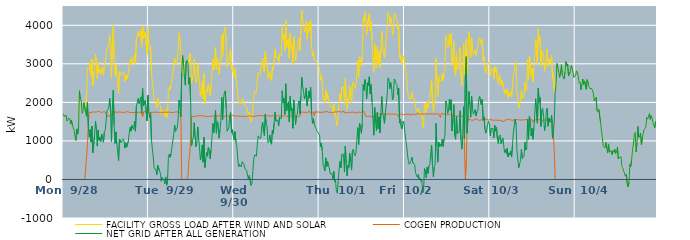
| Category | FACILITY GROSS LOAD AFTER WIND AND SOLAR | COGEN PRODUCTION | NET GRID AFTER ALL GENERATION |
|---|---|---|---|
|  Mon  9/28 | 1703 | 0 | 1703 |
|  Mon  9/28 | 1626 | 0 | 1626 |
|  Mon  9/28 | 1619 | 0 | 1619 |
|  Mon  9/28 | 1670 | 0 | 1670 |
|  Mon  9/28 | 1515 | 0 | 1515 |
|  Mon  9/28 | 1556 | 0 | 1556 |
|  Mon  9/28 | 1595 | 0 | 1595 |
|  Mon  9/28 | 1568 | 0 | 1568 |
|  Mon  9/28 | 1447 | 0 | 1447 |
|  Mon  9/28 | 1543 | 0 | 1543 |
|  Mon  9/28 | 1411 | 0 | 1411 |
|  Mon  9/28 | 1434 | 0 | 1434 |
|  Mon  9/28 | 1281 | 0 | 1281 |
|  Mon  9/28 | 1116 | 0 | 1116 |
|  Mon  9/28 | 1014 | 0 | 1014 |
|  Mon  9/28 | 1313 | 0 | 1313 |
|  Mon  9/28 | 1176 | 0 | 1176 |
|  Mon  9/28 | 1331 | 0 | 1331 |
|  Mon  9/28 | 2301 | 0 | 2301 |
|  Mon  9/28 | 2083 | 0 | 2083 |
|  Mon  9/28 | 2044 | 0 | 2044 |
|  Mon  9/28 | 1716 | 0 | 1716 |
|  Mon  9/28 | 1762 | 0 | 1762 |
|  Mon  9/28 | 1992 | 0 | 1992 |
|  Mon  9/28 | 1969 | 0 | 1969 |
|  Mon  9/28 | 1754 | 0 | 1754 |
|  Mon  9/28 | 2231 | 593 | 1638 |
|  Mon  9/28 | 2897 | 901 | 1996 |
|  Mon  9/28 | 2872 | 1488 | 1384 |
|  Mon  9/28 | 2842 | 1745 | 1097 |
|  Mon  9/28 | 3033 | 1740 | 1293 |
|  Mon  9/28 | 2704 | 1734 | 970 |
|  Mon  9/28 | 3122 | 1739 | 1383 |
|  Mon  9/28 | 2438 | 1752 | 686 |
|  Mon  9/28 | 2437 | 1738 | 699 |
|  Mon  9/28 | 2882 | 1747 | 1135 |
|  Mon  9/28 | 3245 | 1741 | 1504 |
|  Mon  9/28 | 3057 | 1749 | 1308 |
|  Mon  9/28 | 2603 | 1738 | 865 |
|  Mon  9/28 | 3045 | 1765 | 1280 |
|  Mon  9/28 | 2768 | 1755 | 1013 |
|  Mon  9/28 | 2844 | 1750 | 1094 |
|  Mon  9/28 | 2729 | 1746 | 983 |
|  Mon  9/28 | 2912 | 1739 | 1173 |
|  Mon  9/28 | 2822 | 1757 | 1065 |
|  Mon  9/28 | 2722 | 1757 | 965 |
|  Mon  9/28 | 2969 | 1734 | 1235 |
|  Mon  9/28 | 3024 | 1750 | 1274 |
|  Mon  9/28 | 3035 | 1738 | 1297 |
|  Mon  9/28 | 3433 | 1648 | 1785 |
|  Mon  9/28 | 3402 | 1635 | 1767 |
|  Mon  9/28 | 3506 | 1651 | 1855 |
|  Mon  9/28 | 3754 | 1643 | 2111 |
|  Mon  9/28 | 3448 | 1638 | 1810 |
|  Mon  9/28 | 2638 | 1655 | 983 |
|  Mon  9/28 | 3520 | 1697 | 1823 |
|  Mon  9/28 | 4006 | 1689 | 2317 |
|  Mon  9/28 | 3122 | 1704 | 1418 |
|  Mon  9/28 | 2707 | 1774 | 933 |
|  Mon  9/28 | 2972 | 1738 | 1234 |
|  Mon  9/28 | 2686 | 1751 | 935 |
|  Mon  9/28 | 2477 | 1745 | 732 |
|  Mon  9/28 | 2230 | 1739 | 491 |
|  Mon  9/28 | 2799 | 1750 | 1049 |
|  Mon  9/28 | 2808 | 1758 | 1050 |
|  Mon  9/28 | 2702 | 1745 | 957 |
|  Mon  9/28 | 2719 | 1741 | 978 |
|  Mon  9/28 | 2794 | 1740 | 1054 |
|  Mon  9/28 | 2754 | 1730 | 1024 |
|  Mon  9/28 | 2546 | 1732 | 814 |
|  Mon  9/28 | 2713 | 1761 | 952 |
|  Mon  9/28 | 2585 | 1748 | 837 |
|  Mon  9/28 | 2584 | 1756 | 828 |
|  Mon  9/28 | 2750 | 1756 | 994 |
|  Mon  9/28 | 2946 | 1743 | 1203 |
|  Mon  9/28 | 3089 | 1734 | 1355 |
|  Mon  9/28 | 2987 | 1734 | 1253 |
|  Mon  9/28 | 3159 | 1756 | 1403 |
|  Mon  9/28 | 3068 | 1736 | 1332 |
|  Mon  9/28 | 3037 | 1738 | 1299 |
|  Mon  9/28 | 3249 | 1738 | 1511 |
|  Mon  9/28 | 2991 | 1740 | 1251 |
|  Mon  9/28 | 3643 | 1742 | 1901 |
|  Mon  9/28 | 3654 | 1741 | 1913 |
|  Mon  9/28 | 3842 | 1741 | 2101 |
|  Mon  9/28 | 3708 | 1736 | 1972 |
|  Mon  9/28 | 3789 | 1745 | 2044 |
|  Mon  9/28 | 3880 | 1740 | 2140 |
|  Mon  9/28 | 3451 | 1740 | 1711 |
|  Mon  9/28 | 3986 | 1628 | 2358 |
|  Mon  9/28 | 3657 | 1752 | 1905 |
|  Mon  9/28 | 3663 | 1750 | 1913 |
|  Mon  9/28 | 3811 | 1764 | 2047 |
|  Mon  9/28 | 3834 | 1762 | 2072 |
|  Mon  9/28 | 3249 | 1731 | 1518 |
|  Mon  9/28 | 3939 | 1754 | 2185 |
|  Tue  9/29 | 3502 | 1741 | 1761 |
|  Tue  9/29 | 3363 | 1758 | 1605 |
|  Tue  9/29 | 3459 | 1734 | 1725 |
|  Tue  9/29 | 2756 | 1724 | 1032 |
|  Tue  9/29 | 2527 | 1742 | 785 |
|  Tue  9/29 | 2349 | 1758 | 591 |
|  Tue  9/29 | 2045 | 1743 | 302 |
|  Tue  9/29 | 2040 | 1759 | 281 |
|  Tue  9/29 | 1990 | 1749 | 241 |
|  Tue  9/29 | 1871 | 1753 | 118 |
|  Tue  9/29 | 2109 | 1741 | 368 |
|  Tue  9/29 | 2097 | 1754 | 343 |
|  Tue  9/29 | 1961 | 1735 | 226 |
|  Tue  9/29 | 1903 | 1738 | 165 |
|  Tue  9/29 | 1694 | 1743 | -49 |
|  Tue  9/29 | 1797 | 1745 | 52 |
|  Tue  9/29 | 1766 | 1739 | 27 |
|  Tue  9/29 | 1738 | 1739 | -1 |
|  Tue  9/29 | 1639 | 1747 | -108 |
|  Tue  9/29 | 1812 | 1746 | 66 |
|  Tue  9/29 | 1593 | 1743 | -150 |
|  Tue  9/29 | 1678 | 1748 | -70 |
|  Tue  9/29 | 2294 | 1747 | 547 |
|  Tue  9/29 | 2397 | 1737 | 660 |
|  Tue  9/29 | 2322 | 1745 | 577 |
|  Tue  9/29 | 2423 | 1750 | 673 |
|  Tue  9/29 | 2588 | 1737 | 851 |
|  Tue  9/29 | 2579 | 1747 | 832 |
|  Tue  9/29 | 2898 | 1735 | 1163 |
|  Tue  9/29 | 3152 | 1738 | 1414 |
|  Tue  9/29 | 3002 | 1752 | 1250 |
|  Tue  9/29 | 2973 | 1744 | 1229 |
|  Tue  9/29 | 3089 | 1752 | 1337 |
|  Tue  9/29 | 3325 | 1746 | 1579 |
|  Tue  9/29 | 3803 | 1742 | 2061 |
|  Tue  9/29 | 3639 | 1749 | 1890 |
|  Tue  9/29 | 3363 | 1731 | 1632 |
|  Tue  9/29 | 2765 | 0 | 2765 |
|  Tue  9/29 | 3217 | 0 | 3217 |
|  Tue  9/29 | 3011 | 0 | 3011 |
|  Tue  9/29 | 2675 | 0 | 2675 |
|  Tue  9/29 | 2447 | 0 | 2447 |
|  Tue  9/29 | 3049 | 0 | 3049 |
|  Tue  9/29 | 3095 | 0 | 3095 |
|  Tue  9/29 | 3071 | 67 | 3004 |
|  Tue  9/29 | 2972 | 501 | 2471 |
|  Tue  9/29 | 3275 | 638 | 2637 |
|  Tue  9/29 | 3156 | 1097 | 2059 |
|  Tue  9/29 | 2489 | 1624 | 865 |
|  Tue  9/29 | 2636 | 1643 | 993 |
|  Tue  9/29 | 2713 | 1633 | 1080 |
|  Tue  9/29 | 3126 | 1654 | 1472 |
|  Tue  9/29 | 3107 | 1630 | 1477 |
|  Tue  9/29 | 2511 | 1656 | 855 |
|  Tue  9/29 | 2546 | 1643 | 903 |
|  Tue  9/29 | 3005 | 1642 | 1363 |
|  Tue  9/29 | 2724 | 1645 | 1079 |
|  Tue  9/29 | 2502 | 1659 | 843 |
|  Tue  9/29 | 2158 | 1652 | 506 |
|  Tue  9/29 | 2277 | 1652 | 625 |
|  Tue  9/29 | 2546 | 1649 | 897 |
|  Tue  9/29 | 2103 | 1654 | 449 |
|  Tue  9/29 | 2756 | 1661 | 1095 |
|  Tue  9/29 | 1954 | 1645 | 309 |
|  Tue  9/29 | 2129 | 1612 | 517 |
|  Tue  9/29 | 2338 | 1639 | 699 |
|  Tue  9/29 | 2267 | 1664 | 603 |
|  Tue  9/29 | 2471 | 1632 | 839 |
|  Tue  9/29 | 2388 | 1640 | 748 |
|  Tue  9/29 | 2176 | 1640 | 536 |
|  Tue  9/29 | 2419 | 1649 | 770 |
|  Tue  9/29 | 2736 | 1650 | 1086 |
|  Tue  9/29 | 3117 | 1662 | 1455 |
|  Tue  9/29 | 2854 | 1644 | 1210 |
|  Tue  9/29 | 3155 | 1655 | 1500 |
|  Tue  9/29 | 3434 | 1640 | 1794 |
|  Tue  9/29 | 2842 | 1643 | 1199 |
|  Tue  9/29 | 3138 | 1641 | 1497 |
|  Tue  9/29 | 3085 | 1642 | 1443 |
|  Tue  9/29 | 2727 | 1657 | 1070 |
|  Tue  9/29 | 2929 | 1649 | 1280 |
|  Tue  9/29 | 3165 | 1640 | 1525 |
|  Tue  9/29 | 3769 | 1637 | 2132 |
|  Tue  9/29 | 3190 | 1640 | 1550 |
|  Tue  9/29 | 3742 | 1660 | 2082 |
|  Tue  9/29 | 3876 | 1626 | 2250 |
|  Tue  9/29 | 3954 | 1655 | 2299 |
|  Tue  9/29 | 3503 | 1646 | 1857 |
|  Tue  9/29 | 2913 | 1659 | 1254 |
|  Tue  9/29 | 2955 | 1650 | 1305 |
|  Tue  9/29 | 2967 | 1632 | 1335 |
|  Tue  9/29 | 3300 | 1644 | 1656 |
|  Tue  9/29 | 3372 | 1639 | 1733 |
|  Tue  9/29 | 2860 | 1641 | 1219 |
|  Tue  9/29 | 2955 | 1664 | 1291 |
|  Tue  9/29 | 2776 | 1641 | 1135 |
|  Wed  9/30 | 2667 | 1645 | 1022 |
|  Wed  9/30 | 2878 | 1639 | 1239 |
|  Wed  9/30 | 2616 | 1644 | 972 |
|  Wed  9/30 | 2501 | 1645 | 856 |
|  Wed  9/30 | 2202 | 1646 | 556 |
|  Wed  9/30 | 1973 | 1647 | 326 |
|  Wed  9/30 | 2033 | 1642 | 391 |
|  Wed  9/30 | 2026 | 1650 | 376 |
|  Wed  9/30 | 1961 | 1634 | 327 |
|  Wed  9/30 | 2105 | 1643 | 462 |
|  Wed  9/30 | 2084 | 1642 | 442 |
|  Wed  9/30 | 2041 | 1653 | 388 |
|  Wed  9/30 | 1905 | 1629 | 276 |
|  Wed  9/30 | 1901 | 1633 | 268 |
|  Wed  9/30 | 1880 | 1636 | 244 |
|  Wed  9/30 | 1858 | 1634 | 224 |
|  Wed  9/30 | 1654 | 1653 | 1 |
|  Wed  9/30 | 1748 | 1648 | 100 |
|  Wed  9/30 | 1744 | 1644 | 100 |
|  Wed  9/30 | 1495 | 1650 | -155 |
|  Wed  9/30 | 1543 | 1640 | -97 |
|  Wed  9/30 | 1536 | 1639 | -103 |
|  Wed  9/30 | 2156 | 1633 | 523 |
|  Wed  9/30 | 2287 | 1650 | 637 |
|  Wed  9/30 | 2293 | 1644 | 649 |
|  Wed  9/30 | 2247 | 1642 | 605 |
|  Wed  9/30 | 2555 | 1648 | 907 |
|  Wed  9/30 | 2779 | 1648 | 1131 |
|  Wed  9/30 | 2739 | 1656 | 1083 |
|  Wed  9/30 | 2712 | 1646 | 1066 |
|  Wed  9/30 | 2733 | 1662 | 1071 |
|  Wed  9/30 | 3019 | 1650 | 1369 |
|  Wed  9/30 | 3134 | 1646 | 1488 |
|  Wed  9/30 | 2893 | 1649 | 1244 |
|  Wed  9/30 | 2781 | 1652 | 1129 |
|  Wed  9/30 | 3333 | 1638 | 1695 |
|  Wed  9/30 | 3073 | 1647 | 1426 |
|  Wed  9/30 | 3024 | 1647 | 1377 |
|  Wed  9/30 | 2610 | 1655 | 955 |
|  Wed  9/30 | 2628 | 1643 | 985 |
|  Wed  9/30 | 2798 | 1645 | 1153 |
|  Wed  9/30 | 2618 | 1653 | 965 |
|  Wed  9/30 | 2565 | 1651 | 914 |
|  Wed  9/30 | 2918 | 1638 | 1280 |
|  Wed  9/30 | 2846 | 1653 | 1193 |
|  Wed  9/30 | 3124 | 1647 | 1477 |
|  Wed  9/30 | 3391 | 1644 | 1747 |
|  Wed  9/30 | 3155 | 1642 | 1513 |
|  Wed  9/30 | 3161 | 1648 | 1513 |
|  Wed  9/30 | 3170 | 1634 | 1536 |
|  Wed  9/30 | 3032 | 1647 | 1385 |
|  Wed  9/30 | 3266 | 1655 | 1611 |
|  Wed  9/30 | 3259 | 1646 | 1613 |
|  Wed  9/30 | 3211 | 1636 | 1575 |
|  Wed  9/30 | 3948 | 1649 | 2299 |
|  Wed  9/30 | 3635 | 1647 | 1988 |
|  Wed  9/30 | 3749 | 1650 | 2099 |
|  Wed  9/30 | 3338 | 1648 | 1690 |
|  Wed  9/30 | 4128 | 1646 | 2482 |
|  Wed  9/30 | 3429 | 1653 | 1776 |
|  Wed  9/30 | 3587 | 1640 | 1947 |
|  Wed  9/30 | 3653 | 1639 | 2014 |
|  Wed  9/30 | 3146 | 1651 | 1495 |
|  Wed  9/30 | 3788 | 1633 | 2155 |
|  Wed  9/30 | 3430 | 1646 | 1784 |
|  Wed  9/30 | 3490 | 1642 | 1848 |
|  Wed  9/30 | 2971 | 1643 | 1328 |
|  Wed  9/30 | 3713 | 1651 | 2062 |
|  Wed  9/30 | 3408 | 1638 | 1770 |
|  Wed  9/30 | 3075 | 1650 | 1425 |
|  Wed  9/30 | 3294 | 1645 | 1649 |
|  Wed  9/30 | 3323 | 1645 | 1678 |
|  Wed  9/30 | 3607 | 1635 | 1972 |
|  Wed  9/30 | 3685 | 1647 | 2038 |
|  Wed  9/30 | 3347 | 1645 | 1702 |
|  Wed  9/30 | 3909 | 1749 | 2160 |
|  Wed  9/30 | 4395 | 1748 | 2647 |
|  Wed  9/30 | 4159 | 1748 | 2411 |
|  Wed  9/30 | 4023 | 1737 | 2286 |
|  Wed  9/30 | 3825 | 1741 | 2084 |
|  Wed  9/30 | 3937 | 1765 | 2172 |
|  Wed  9/30 | 4117 | 1743 | 2374 |
|  Wed  9/30 | 3658 | 1753 | 1905 |
|  Wed  9/30 | 3657 | 1736 | 1921 |
|  Wed  9/30 | 4076 | 1779 | 2297 |
|  Wed  9/30 | 3854 | 1740 | 2114 |
|  Wed  9/30 | 4124 | 1730 | 2394 |
|  Wed  9/30 | 3477 | 1748 | 1729 |
|  Wed  9/30 | 3208 | 1753 | 1455 |
|  Wed  9/30 | 3324 | 1746 | 1578 |
|  Wed  9/30 | 3104 | 1663 | 1441 |
|  Wed  9/30 | 3122 | 1756 | 1366 |
|  Wed  9/30 | 3066 | 1745 | 1321 |
|  Wed  9/30 | 3013 | 1750 | 1263 |
|  Wed  9/30 | 2967 | 1736 | 1231 |
|  Wed  9/30 | 2987 | 1747 | 1240 |
|  Thu  10/1 | 2893 | 1744 | 1149 |
|  Thu  10/1 | 2587 | 1741 | 846 |
|  Thu  10/1 | 2697 | 1751 | 946 |
|  Thu  10/1 | 2502 | 1743 | 759 |
|  Thu  10/1 | 2124 | 1743 | 381 |
|  Thu  10/1 | 2055 | 1746 | 309 |
|  Thu  10/1 | 1976 | 1757 | 219 |
|  Thu  10/1 | 2326 | 1764 | 562 |
|  Thu  10/1 | 2075 | 1745 | 330 |
|  Thu  10/1 | 2227 | 1755 | 472 |
|  Thu  10/1 | 2088 | 1739 | 349 |
|  Thu  10/1 | 2036 | 1735 | 301 |
|  Thu  10/1 | 1897 | 1750 | 147 |
|  Thu  10/1 | 1876 | 1747 | 129 |
|  Thu  10/1 | 1897 | 1743 | 154 |
|  Thu  10/1 | 1730 | 1738 | -8 |
|  Thu  10/1 | 1952 | 1744 | 208 |
|  Thu  10/1 | 1687 | 1751 | -64 |
|  Thu  10/1 | 1714 | 1738 | -24 |
|  Thu  10/1 | 1433 | 1746 | -313 |
|  Thu  10/1 | 1392 | 1751 | -359 |
|  Thu  10/1 | 1398 | 1764 | -366 |
|  Thu  10/1 | 2024 | 1755 | 269 |
|  Thu  10/1 | 2216 | 1753 | 463 |
|  Thu  10/1 | 2039 | 1741 | 298 |
|  Thu  10/1 | 2392 | 1750 | 642 |
|  Thu  10/1 | 2409 | 1740 | 669 |
|  Thu  10/1 | 2410 | 1777 | 633 |
|  Thu  10/1 | 1928 | 1736 | 192 |
|  Thu  10/1 | 2617 | 1751 | 866 |
|  Thu  10/1 | 2132 | 1726 | 406 |
|  Thu  10/1 | 1829 | 1736 | 93 |
|  Thu  10/1 | 2110 | 1743 | 367 |
|  Thu  10/1 | 2063 | 1749 | 314 |
|  Thu  10/1 | 2414 | 1739 | 675 |
|  Thu  10/1 | 2235 | 1748 | 487 |
|  Thu  10/1 | 1987 | 1744 | 243 |
|  Thu  10/1 | 2471 | 1738 | 733 |
|  Thu  10/1 | 2534 | 1747 | 787 |
|  Thu  10/1 | 2432 | 1755 | 677 |
|  Thu  10/1 | 2357 | 1741 | 616 |
|  Thu  10/1 | 2449 | 1752 | 697 |
|  Thu  10/1 | 2755 | 1724 | 1031 |
|  Thu  10/1 | 3090 | 1749 | 1341 |
|  Thu  10/1 | 2656 | 1750 | 906 |
|  Thu  10/1 | 3194 | 1732 | 1462 |
|  Thu  10/1 | 3056 | 1732 | 1324 |
|  Thu  10/1 | 2935 | 1736 | 1199 |
|  Thu  10/1 | 3198 | 1752 | 1446 |
|  Thu  10/1 | 4204 | 1743 | 2461 |
|  Thu  10/1 | 4082 | 1770 | 2312 |
|  Thu  10/1 | 4335 | 1745 | 2590 |
|  Thu  10/1 | 4115 | 1637 | 2478 |
|  Thu  10/1 | 3744 | 1649 | 2095 |
|  Thu  10/1 | 4140 | 1631 | 2509 |
|  Thu  10/1 | 4077 | 1637 | 2440 |
|  Thu  10/1 | 4303 | 1639 | 2664 |
|  Thu  10/1 | 3862 | 1646 | 2216 |
|  Thu  10/1 | 4109 | 1650 | 2459 |
|  Thu  10/1 | 3619 | 1603 | 2016 |
|  Thu  10/1 | 3202 | 1579 | 1623 |
|  Thu  10/1 | 2785 | 1637 | 1148 |
|  Thu  10/1 | 3511 | 1641 | 1870 |
|  Thu  10/1 | 3160 | 1638 | 1522 |
|  Thu  10/1 | 2892 | 1633 | 1259 |
|  Thu  10/1 | 3441 | 1699 | 1742 |
|  Thu  10/1 | 3008 | 1700 | 1308 |
|  Thu  10/1 | 3322 | 1693 | 1629 |
|  Thu  10/1 | 2891 | 1683 | 1208 |
|  Thu  10/1 | 3411 | 1688 | 1723 |
|  Thu  10/1 | 3846 | 1695 | 2151 |
|  Thu  10/1 | 3439 | 1705 | 1734 |
|  Thu  10/1 | 3267 | 1671 | 1596 |
|  Thu  10/1 | 3162 | 1706 | 1456 |
|  Thu  10/1 | 3404 | 1687 | 1717 |
|  Thu  10/1 | 3612 | 1689 | 1923 |
|  Thu  10/1 | 3858 | 1677 | 2181 |
|  Thu  10/1 | 4339 | 1701 | 2638 |
|  Thu  10/1 | 4311 | 1705 | 2606 |
|  Thu  10/1 | 4049 | 1696 | 2353 |
|  Thu  10/1 | 4208 | 1694 | 2514 |
|  Thu  10/1 | 4083 | 1693 | 2390 |
|  Thu  10/1 | 3748 | 1683 | 2065 |
|  Thu  10/1 | 3808 | 1697 | 2111 |
|  Thu  10/1 | 4311 | 1704 | 2607 |
|  Thu  10/1 | 4256 | 1688 | 2568 |
|  Thu  10/1 | 4185 | 1696 | 2489 |
|  Thu  10/1 | 4156 | 1693 | 2463 |
|  Thu  10/1 | 3902 | 1698 | 2204 |
|  Thu  10/1 | 3990 | 1623 | 2367 |
|  Thu  10/1 | 3156 | 1694 | 1462 |
|  Thu  10/1 | 3238 | 1683 | 1555 |
|  Thu  10/1 | 3048 | 1695 | 1353 |
|  Thu  10/1 | 2990 | 1684 | 1306 |
|  Thu  10/1 | 3197 | 1685 | 1512 |
|  Thu  10/1 | 3138 | 1692 | 1446 |
|  Fri  10/2 | 2882 | 1677 | 1205 |
|  Fri  10/2 | 2854 | 1663 | 1191 |
|  Fri  10/2 | 2562 | 1702 | 860 |
|  Fri  10/2 | 2328 | 1695 | 633 |
|  Fri  10/2 | 2141 | 1678 | 463 |
|  Fri  10/2 | 2104 | 1710 | 394 |
|  Fri  10/2 | 2068 | 1669 | 399 |
|  Fri  10/2 | 2184 | 1693 | 491 |
|  Fri  10/2 | 2257 | 1682 | 575 |
|  Fri  10/2 | 2103 | 1682 | 421 |
|  Fri  10/2 | 2111 | 1697 | 414 |
|  Fri  10/2 | 2089 | 1697 | 392 |
|  Fri  10/2 | 1850 | 1678 | 172 |
|  Fri  10/2 | 1868 | 1685 | 183 |
|  Fri  10/2 | 1755 | 1698 | 57 |
|  Fri  10/2 | 1856 | 1731 | 125 |
|  Fri  10/2 | 1683 | 1687 | -4 |
|  Fri  10/2 | 1739 | 1699 | 40 |
|  Fri  10/2 | 1648 | 1700 | -52 |
|  Fri  10/2 | 1686 | 1700 | -14 |
|  Fri  10/2 | 1349 | 1691 | -342 |
|  Fri  10/2 | 1390 | 1684 | -294 |
|  Fri  10/2 | 1981 | 1695 | 286 |
|  Fri  10/2 | 1909 | 1704 | 205 |
|  Fri  10/2 | 1740 | 1695 | 45 |
|  Fri  10/2 | 2004 | 1686 | 318 |
|  Fri  10/2 | 1865 | 1704 | 161 |
|  Fri  10/2 | 2040 | 1693 | 347 |
|  Fri  10/2 | 2085 | 1698 | 387 |
|  Fri  10/2 | 2367 | 1689 | 678 |
|  Fri  10/2 | 2590 | 1699 | 891 |
|  Fri  10/2 | 2062 | 1679 | 383 |
|  Fri  10/2 | 1761 | 1694 | 67 |
|  Fri  10/2 | 2022 | 1689 | 333 |
|  Fri  10/2 | 2078 | 1698 | 380 |
|  Fri  10/2 | 3151 | 1697 | 1454 |
|  Fri  10/2 | 2554 | 1701 | 853 |
|  Fri  10/2 | 2139 | 1691 | 448 |
|  Fri  10/2 | 2667 | 1699 | 968 |
|  Fri  10/2 | 2543 | 1689 | 854 |
|  Fri  10/2 | 2527 | 1608 | 919 |
|  Fri  10/2 | 2570 | 1714 | 856 |
|  Fri  10/2 | 2747 | 1706 | 1041 |
|  Fri  10/2 | 2556 | 1699 | 857 |
|  Fri  10/2 | 2745 | 1699 | 1046 |
|  Fri  10/2 | 2824 | 1697 | 1127 |
|  Fri  10/2 | 3743 | 1703 | 2040 |
|  Fri  10/2 | 3630 | 1681 | 1949 |
|  Fri  10/2 | 3407 | 1693 | 1714 |
|  Fri  10/2 | 3445 | 1683 | 1762 |
|  Fri  10/2 | 3775 | 1700 | 2075 |
|  Fri  10/2 | 3493 | 1694 | 1799 |
|  Fri  10/2 | 3776 | 1706 | 2070 |
|  Fri  10/2 | 2942 | 1684 | 1258 |
|  Fri  10/2 | 3202 | 1638 | 1564 |
|  Fri  10/2 | 3584 | 1641 | 1943 |
|  Fri  10/2 | 2795 | 1643 | 1152 |
|  Fri  10/2 | 2684 | 1641 | 1043 |
|  Fri  10/2 | 3297 | 1652 | 1645 |
|  Fri  10/2 | 2849 | 1652 | 1197 |
|  Fri  10/2 | 2834 | 1646 | 1188 |
|  Fri  10/2 | 2870 | 1640 | 1230 |
|  Fri  10/2 | 3421 | 1639 | 1782 |
|  Fri  10/2 | 2662 | 1641 | 1021 |
|  Fri  10/2 | 2426 | 1639 | 787 |
|  Fri  10/2 | 2774 | 1646 | 1128 |
|  Fri  10/2 | 3522 | 1635 | 1887 |
|  Fri  10/2 | 2695 | 1632 | 1063 |
|  Fri  10/2 | 2709 | 0 | 2709 |
|  Fri  10/2 | 3639 | 453 | 3186 |
|  Fri  10/2 | 2758 | 1556 | 1202 |
|  Fri  10/2 | 3250 | 1575 | 1675 |
|  Fri  10/2 | 3838 | 1553 | 2285 |
|  Fri  10/2 | 3486 | 1543 | 1943 |
|  Fri  10/2 | 3166 | 1551 | 1615 |
|  Fri  10/2 | 3692 | 1529 | 2163 |
|  Fri  10/2 | 3352 | 1519 | 1833 |
|  Fri  10/2 | 3245 | 1552 | 1693 |
|  Fri  10/2 | 3290 | 1536 | 1754 |
|  Fri  10/2 | 3360 | 1549 | 1811 |
|  Fri  10/2 | 3221 | 1576 | 1645 |
|  Fri  10/2 | 3309 | 1554 | 1755 |
|  Fri  10/2 | 3327 | 1545 | 1782 |
|  Fri  10/2 | 3618 | 1540 | 2078 |
|  Fri  10/2 | 3685 | 1533 | 2152 |
|  Fri  10/2 | 3703 | 1551 | 2152 |
|  Fri  10/2 | 3485 | 1547 | 1938 |
|  Fri  10/2 | 3630 | 1551 | 2079 |
|  Fri  10/2 | 3079 | 1537 | 1542 |
|  Fri  10/2 | 3180 | 1555 | 1625 |
|  Fri  10/2 | 2846 | 1552 | 1294 |
|  Fri  10/2 | 2758 | 1555 | 1203 |
|  Fri  10/2 | 2858 | 1557 | 1301 |
|  Fri  10/2 | 2966 | 1550 | 1416 |
|  Fri  10/2 | 3053 | 1542 | 1511 |
|  Fri  10/2 | 2983 | 1537 | 1446 |
|  Sat  10/3 | 2683 | 1552 | 1131 |
|  Sat  10/3 | 2853 | 1533 | 1320 |
|  Sat  10/3 | 2873 | 1546 | 1327 |
|  Sat  10/3 | 2895 | 1570 | 1325 |
|  Sat  10/3 | 2605 | 1529 | 1076 |
|  Sat  10/3 | 2931 | 1523 | 1408 |
|  Sat  10/3 | 2802 | 1548 | 1254 |
|  Sat  10/3 | 2916 | 1556 | 1360 |
|  Sat  10/3 | 2589 | 1531 | 1058 |
|  Sat  10/3 | 2478 | 1547 | 931 |
|  Sat  10/3 | 2652 | 1538 | 1114 |
|  Sat  10/3 | 2705 | 1549 | 1156 |
|  Sat  10/3 | 2461 | 1535 | 926 |
|  Sat  10/3 | 2569 | 1546 | 1023 |
|  Sat  10/3 | 2586 | 1506 | 1080 |
|  Sat  10/3 | 2396 | 1491 | 905 |
|  Sat  10/3 | 2211 | 1508 | 703 |
|  Sat  10/3 | 2325 | 1552 | 773 |
|  Sat  10/3 | 2235 | 1563 | 672 |
|  Sat  10/3 | 2352 | 1546 | 806 |
|  Sat  10/3 | 2130 | 1546 | 584 |
|  Sat  10/3 | 2247 | 1558 | 689 |
|  Sat  10/3 | 2178 | 1547 | 631 |
|  Sat  10/3 | 2285 | 1546 | 739 |
|  Sat  10/3 | 2136 | 1555 | 581 |
|  Sat  10/3 | 2428 | 1529 | 899 |
|  Sat  10/3 | 2749 | 1515 | 1234 |
|  Sat  10/3 | 2779 | 1558 | 1221 |
|  Sat  10/3 | 3039 | 1480 | 1559 |
|  Sat  10/3 | 2983 | 1558 | 1425 |
|  Sat  10/3 | 2296 | 1554 | 742 |
|  Sat  10/3 | 2296 | 1553 | 743 |
|  Sat  10/3 | 1859 | 1551 | 308 |
|  Sat  10/3 | 1941 | 1542 | 399 |
|  Sat  10/3 | 2030 | 1540 | 490 |
|  Sat  10/3 | 2322 | 1544 | 778 |
|  Sat  10/3 | 2093 | 1547 | 546 |
|  Sat  10/3 | 2094 | 1544 | 550 |
|  Sat  10/3 | 2166 | 1554 | 612 |
|  Sat  10/3 | 2520 | 1550 | 970 |
|  Sat  10/3 | 2306 | 1544 | 762 |
|  Sat  10/3 | 2344 | 1554 | 790 |
|  Sat  10/3 | 3112 | 1543 | 1569 |
|  Sat  10/3 | 2585 | 1546 | 1039 |
|  Sat  10/3 | 3195 | 1552 | 1643 |
|  Sat  10/3 | 3058 | 1551 | 1507 |
|  Sat  10/3 | 2680 | 1547 | 1133 |
|  Sat  10/3 | 2877 | 1549 | 1328 |
|  Sat  10/3 | 2529 | 1483 | 1046 |
|  Sat  10/3 | 2862 | 1539 | 1323 |
|  Sat  10/3 | 3232 | 1563 | 1669 |
|  Sat  10/3 | 3640 | 1546 | 2094 |
|  Sat  10/3 | 3626 | 1540 | 2086 |
|  Sat  10/3 | 3015 | 1556 | 1459 |
|  Sat  10/3 | 3910 | 1539 | 2371 |
|  Sat  10/3 | 3549 | 1549 | 2000 |
|  Sat  10/3 | 3684 | 1560 | 2124 |
|  Sat  10/3 | 2941 | 1565 | 1376 |
|  Sat  10/3 | 3346 | 1544 | 1802 |
|  Sat  10/3 | 3352 | 1506 | 1846 |
|  Sat  10/3 | 3179 | 1554 | 1625 |
|  Sat  10/3 | 2803 | 1540 | 1263 |
|  Sat  10/3 | 2935 | 1533 | 1402 |
|  Sat  10/3 | 3291 | 1545 | 1746 |
|  Sat  10/3 | 3390 | 1544 | 1846 |
|  Sat  10/3 | 2935 | 1555 | 1380 |
|  Sat  10/3 | 3129 | 1535 | 1594 |
|  Sat  10/3 | 3033 | 1548 | 1485 |
|  Sat  10/3 | 3073 | 1556 | 1517 |
|  Sat  10/3 | 3220 | 1559 | 1661 |
|  Sat  10/3 | 2623 | 1555 | 1068 |
|  Sat  10/3 | 2767 | 1553 | 1214 |
|  Sat  10/3 | 2280 | 742 | 1538 |
|  Sat  10/3 | 2266 | 0 | 2266 |
|  Sat  10/3 | 2493 | 0 | 2493 |
|  Sat  10/3 | 3006 | 0 | 3006 |
|  Sat  10/3 | 2902 | 0 | 2902 |
|  Sat  10/3 | 2776 | 0 | 2776 |
|  Sat  10/3 | 2651 | 0 | 2651 |
|  Sat  10/3 | 2786 | 0 | 2786 |
|  Sat  10/3 | 2979 | 0 | 2979 |
|  Sat  10/3 | 2720 | 0 | 2720 |
|  Sat  10/3 | 2744 | 0 | 2744 |
|  Sat  10/3 | 2606 | 0 | 2606 |
|  Sat  10/3 | 2786 | 0 | 2786 |
|  Sat  10/3 | 3059 | 0 | 3059 |
|  Sat  10/3 | 2944 | 0 | 2944 |
|  Sat  10/3 | 2997 | 0 | 2997 |
|  Sat  10/3 | 2688 | 0 | 2688 |
|  Sat  10/3 | 2687 | 0 | 2687 |
|  Sat  10/3 | 2795 | 0 | 2795 |
|  Sat  10/3 | 2956 | 0 | 2956 |
|  Sat  10/3 | 2891 | 0 | 2891 |
|  Sat  10/3 | 2778 | 0 | 2778 |
|  Sat  10/3 | 2649 | 0 | 2649 |
|  Sat  10/3 | 2624 | 0 | 2624 |
|  Sun  10/4 | 2707 | 0 | 2707 |
|  Sun  10/4 | 2819 | 0 | 2819 |
|  Sun  10/4 | 2763 | 0 | 2763 |
|  Sun  10/4 | 2662 | 0 | 2662 |
|  Sun  10/4 | 2497 | 0 | 2497 |
|  Sun  10/4 | 2523 | 0 | 2523 |
|  Sun  10/4 | 2327 | 0 | 2327 |
|  Sun  10/4 | 2461 | 0 | 2461 |
|  Sun  10/4 | 2606 | 0 | 2606 |
|  Sun  10/4 | 2464 | 0 | 2464 |
|  Sun  10/4 | 2557 | 0 | 2557 |
|  Sun  10/4 | 2537 | 0 | 2537 |
|  Sun  10/4 | 2338 | 0 | 2338 |
|  Sun  10/4 | 2590 | 0 | 2590 |
|  Sun  10/4 | 2504 | 0 | 2504 |
|  Sun  10/4 | 2405 | 0 | 2405 |
|  Sun  10/4 | 2352 | 0 | 2352 |
|  Sun  10/4 | 2331 | 0 | 2331 |
|  Sun  10/4 | 2362 | 0 | 2362 |
|  Sun  10/4 | 2373 | 0 | 2373 |
|  Sun  10/4 | 2236 | 0 | 2236 |
|  Sun  10/4 | 2035 | 0 | 2035 |
|  Sun  10/4 | 2013 | 0 | 2013 |
|  Sun  10/4 | 2133 | 0 | 2133 |
|  Sun  10/4 | 1786 | 0 | 1786 |
|  Sun  10/4 | 1754 | 0 | 1754 |
|  Sun  10/4 | 1820 | 0 | 1820 |
|  Sun  10/4 | 1803 | 0 | 1803 |
|  Sun  10/4 | 1488 | 0 | 1488 |
|  Sun  10/4 | 1274 | 0 | 1274 |
|  Sun  10/4 | 1083 | 0 | 1083 |
|  Sun  10/4 | 869 | 0 | 869 |
|  Sun  10/4 | 859 | 0 | 859 |
|  Sun  10/4 | 818 | 0 | 818 |
|  Sun  10/4 | 966 | 0 | 966 |
|  Sun  10/4 | 809 | 0 | 809 |
|  Sun  10/4 | 687 | 0 | 687 |
|  Sun  10/4 | 922 | 0 | 922 |
|  Sun  10/4 | 707 | 0 | 707 |
|  Sun  10/4 | 715 | 0 | 715 |
|  Sun  10/4 | 746 | 0 | 746 |
|  Sun  10/4 | 639 | 0 | 639 |
|  Sun  10/4 | 747 | 0 | 747 |
|  Sun  10/4 | 700 | 0 | 700 |
|  Sun  10/4 | 787 | 0 | 787 |
|  Sun  10/4 | 671 | 0 | 671 |
|  Sun  10/4 | 715 | 0 | 715 |
|  Sun  10/4 | 843 | 0 | 843 |
|  Sun  10/4 | 532 | 0 | 532 |
|  Sun  10/4 | 564 | 0 | 564 |
|  Sun  10/4 | 539 | 0 | 539 |
|  Sun  10/4 | 592 | 0 | 592 |
|  Sun  10/4 | 337 | 0 | 337 |
|  Sun  10/4 | 305 | 0 | 305 |
|  Sun  10/4 | 223 | 0 | 223 |
|  Sun  10/4 | 218 | 0 | 218 |
|  Sun  10/4 | 83 | 0 | 83 |
|  Sun  10/4 | 135 | 0 | 135 |
|  Sun  10/4 | -105 | 0 | -105 |
|  Sun  10/4 | -195 | 0 | -195 |
|  Sun  10/4 | -73 | 0 | -73 |
|  Sun  10/4 | 391 | 0 | 391 |
|  Sun  10/4 | 335 | 0 | 335 |
|  Sun  10/4 | 519 | 0 | 519 |
|  Sun  10/4 | 781 | 0 | 781 |
|  Sun  10/4 | 920 | 0 | 920 |
|  Sun  10/4 | 1177 | 0 | 1177 |
|  Sun  10/4 | 1219 | 0 | 1219 |
|  Sun  10/4 | 716 | 0 | 716 |
|  Sun  10/4 | 945 | 0 | 945 |
|  Sun  10/4 | 1375 | 0 | 1375 |
|  Sun  10/4 | 1090 | 0 | 1090 |
|  Sun  10/4 | 1118 | 0 | 1118 |
|  Sun  10/4 | 1202 | 0 | 1202 |
|  Sun  10/4 | 903 | 0 | 903 |
|  Sun  10/4 | 1063 | 0 | 1063 |
|  Sun  10/4 | 1191 | 0 | 1191 |
|  Sun  10/4 | 1293 | 0 | 1293 |
|  Sun  10/4 | 1324 | 0 | 1324 |
|  Sun  10/4 | 1361 | 0 | 1361 |
|  Sun  10/4 | 1608 | 0 | 1608 |
|  Sun  10/4 | 1566 | 0 | 1566 |
|  Sun  10/4 | 1559 | 0 | 1559 |
|  Sun  10/4 | 1706 | 0 | 1706 |
|  Sun  10/4 | 1559 | 0 | 1559 |
|  Sun  10/4 | 1655 | 0 | 1655 |
|  Sun  10/4 | 1585 | 0 | 1585 |
|  Sun  10/4 | 1469 | 0 | 1469 |
|  Sun  10/4 | 1406 | 0 | 1406 |
|  Sun  10/4 | 1340 | 0 | 1340 |
|  Sun  10/4 | 1505 | 0 | 1505 |
|  Sun  10/4 | 1492 | 0 | 1492 |